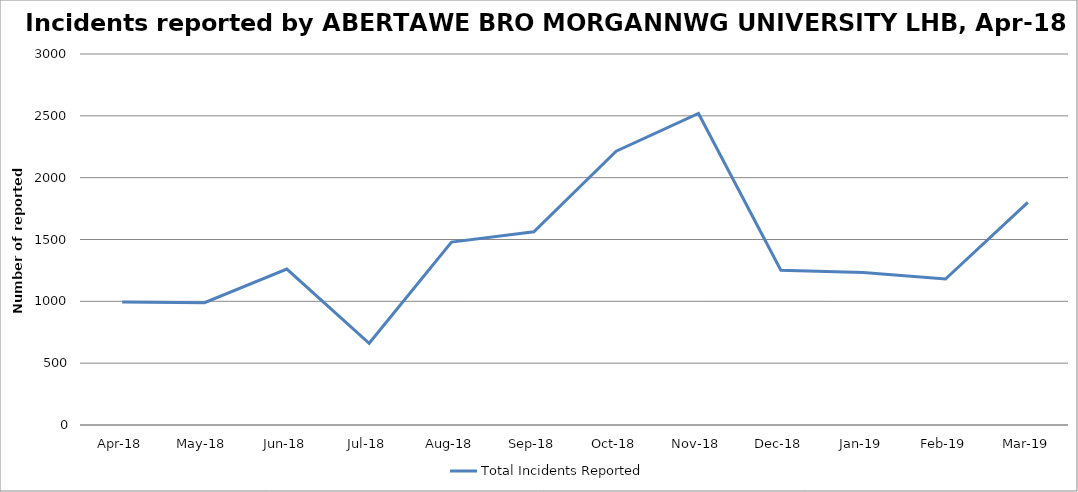
| Category | Total Incidents Reported |
|---|---|
| Apr-18 | 994 |
| May-18 | 989 |
| Jun-18 | 1261 |
| Jul-18 | 661 |
| Aug-18 | 1479 |
| Sep-18 | 1562 |
| Oct-18 | 2214 |
| Nov-18 | 2519 |
| Dec-18 | 1251 |
| Jan-19 | 1234 |
| Feb-19 | 1180 |
| Mar-19 | 1800 |